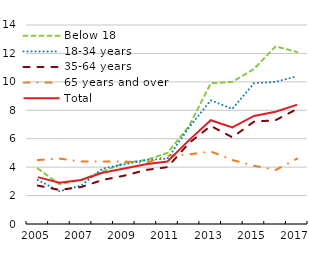
| Category | Below 18 | 18-34 years | 35-64 years | 65 years and over | Total |
|---|---|---|---|---|---|
| 2005.0 | 3.9 | 3.1 | 2.7 | 4.5 | 3.3 |
| 2006.0 | 2.8 | 2.3 | 2.4 | 4.6 | 2.9 |
| 2007.0 | 3.1 | 2.7 | 2.6 | 4.4 | 3.1 |
| 2008.0 | 3.7 | 3.9 | 3.1 | 4.4 | 3.6 |
| 2009.0 | 4.3 | 4.2 | 3.4 | 4.4 | 3.9 |
| 2010.0 | 4.5 | 4.5 | 3.8 | 4.3 | 4.2 |
| 2011.0 | 5 | 4.6 | 4 | 4.8 | 4.4 |
| 2012.0 | 6.9 | 6.8 | 5.7 | 4.9 | 5.9 |
| 2013.0 | 9.9 | 8.7 | 6.9 | 5.1 | 7.3 |
| 2014.0 | 10 | 8.1 | 6.1 | 4.5 | 6.8 |
| 2015.0 | 10.9 | 9.9 | 7.2 | 4.1 | 7.6 |
| 2016.0 | 12.5 | 10 | 7.3 | 3.8 | 7.9 |
| 2017.0 | 12.1 | 10.4 | 8.1 | 4.6 | 8.4 |